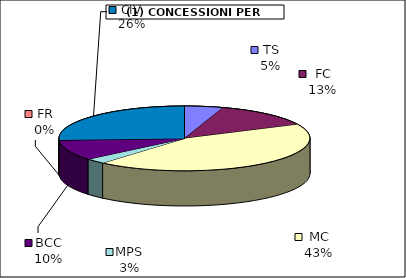
| Category | Series 0 |
|---|---|
| TS | 6186.75 |
| FC | 16097.25 |
| MC | 53805 |
| MPS | 3250 |
| BCC | 12723.5 |
| FR | 0 |
| CIV | 32040.5 |